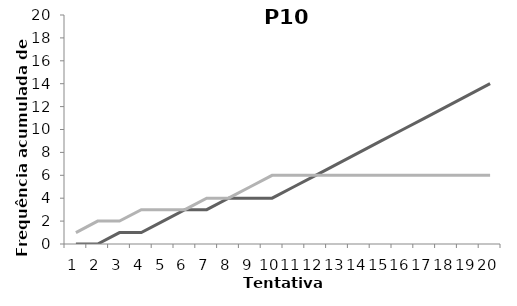
| Category | Acertos | Erros |
|---|---|---|
| 0 | 0 | 1 |
| 1 | 0 | 2 |
| 2 | 1 | 2 |
| 3 | 1 | 3 |
| 4 | 2 | 3 |
| 5 | 3 | 3 |
| 6 | 3 | 4 |
| 7 | 4 | 4 |
| 8 | 4 | 5 |
| 9 | 4 | 6 |
| 10 | 5 | 6 |
| 11 | 6 | 6 |
| 12 | 7 | 6 |
| 13 | 8 | 6 |
| 14 | 9 | 6 |
| 15 | 10 | 6 |
| 16 | 11 | 6 |
| 17 | 12 | 6 |
| 18 | 13 | 6 |
| 19 | 14 | 6 |